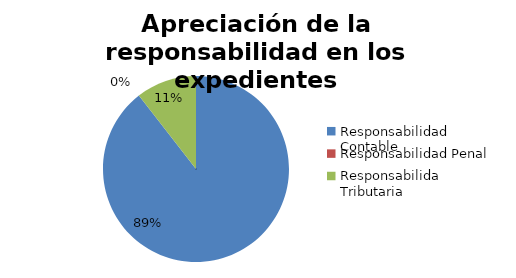
| Category | Series 0 |
|---|---|
| Responsabilidad Contable | 17 |
| Responsabilidad Penal | 0 |
| Responsabilida Tributaria | 2 |